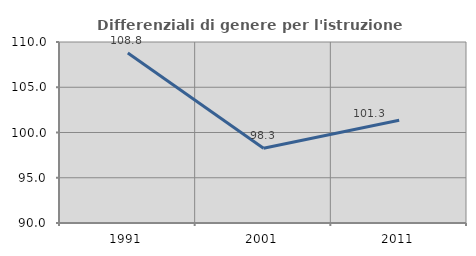
| Category | Differenziali di genere per l'istruzione superiore |
|---|---|
| 1991.0 | 108.774 |
| 2001.0 | 98.253 |
| 2011.0 | 101.347 |